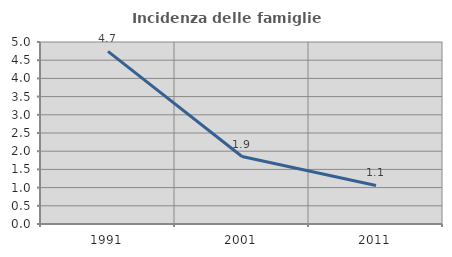
| Category | Incidenza delle famiglie numerose |
|---|---|
| 1991.0 | 4.741 |
| 2001.0 | 1.853 |
| 2011.0 | 1.058 |